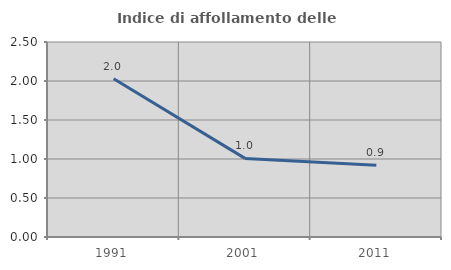
| Category | Indice di affollamento delle abitazioni  |
|---|---|
| 1991.0 | 2.029 |
| 2001.0 | 1.008 |
| 2011.0 | 0.918 |